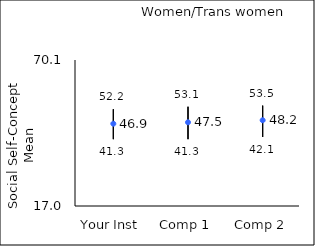
| Category | 25th percentile | 75th percentile | Mean |
|---|---|---|---|
| Your Inst | 41.3 | 52.2 | 46.93 |
| Comp 1 | 41.3 | 53.1 | 47.45 |
| Comp 2 | 42.1 | 53.5 | 48.19 |